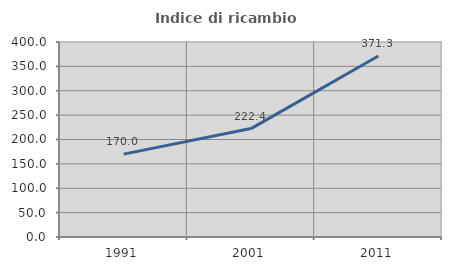
| Category | Indice di ricambio occupazionale  |
|---|---|
| 1991.0 | 169.963 |
| 2001.0 | 222.381 |
| 2011.0 | 371.289 |